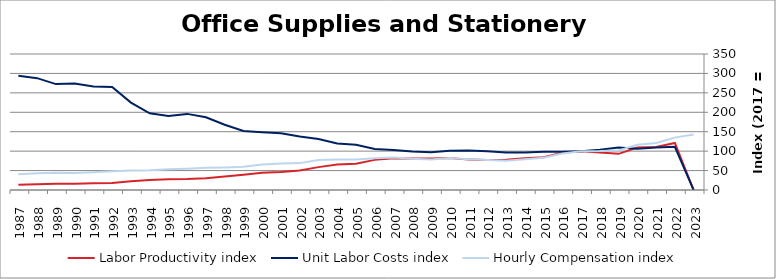
| Category | Labor Productivity index | Unit Labor Costs index | Hourly Compensation index |
|---|---|---|---|
| 2023.0 | 0 | 0 | 142.717 |
| 2022.0 | 121.026 | 111.345 | 134.755 |
| 2021.0 | 110.67 | 109.491 | 121.173 |
| 2020.0 | 109.396 | 106.214 | 116.194 |
| 2019.0 | 93.042 | 109.337 | 101.73 |
| 2018.0 | 96.636 | 103.66 | 100.172 |
| 2017.0 | 100 | 100 | 100 |
| 2016.0 | 95.673 | 98.235 | 93.984 |
| 2015.0 | 84.262 | 98.462 | 82.967 |
| 2014.0 | 81.616 | 96.729 | 78.947 |
| 2013.0 | 77.821 | 96.825 | 75.35 |
| 2012.0 | 77.156 | 99.998 | 77.155 |
| 2011.0 | 78.177 | 101.383 | 79.258 |
| 2010.0 | 82.067 | 100.712 | 82.652 |
| 2009.0 | 80.916 | 97.287 | 78.72 |
| 2008.0 | 81.128 | 98.996 | 80.313 |
| 2007.0 | 81.603 | 102.652 | 83.766 |
| 2006.0 | 77.549 | 105.63 | 81.915 |
| 2005.0 | 67.325 | 116.243 | 78.261 |
| 2004.0 | 65.356 | 119.929 | 78.381 |
| 2003.0 | 58.882 | 131.472 | 77.413 |
| 2002.0 | 50.289 | 137.579 | 69.188 |
| 2001.0 | 46.546 | 145.862 | 67.893 |
| 2000.0 | 44.227 | 148.635 | 65.737 |
| 1999.0 | 39.538 | 152.052 | 60.118 |
| 1998.0 | 34.62 | 167.829 | 58.102 |
| 1997.0 | 30.451 | 187.209 | 57.007 |
| 1996.0 | 28.013 | 195.881 | 54.871 |
| 1995.0 | 27.945 | 190.753 | 53.307 |
| 1994.0 | 25.602 | 197.494 | 50.563 |
| 1993.0 | 22.238 | 224.904 | 50.013 |
| 1992.0 | 18.279 | 264.898 | 48.42 |
| 1991.0 | 17.1 | 266.425 | 45.559 |
| 1990.0 | 15.949 | 273.921 | 43.687 |
| 1989.0 | 16.245 | 272.505 | 44.268 |
| 1988.0 | 14.949 | 287.83 | 43.026 |
| 1987.0 | 13.741 | 293.944 | 40.39 |